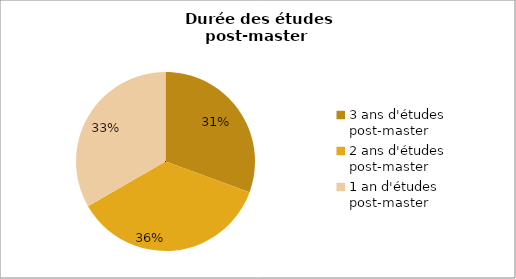
| Category | Promotion 2007 |
|---|---|
| 3 ans d'études post-master | 0.306 |
| 2 ans d'études post-master | 0.361 |
| 1 an d'études post-master | 0.333 |